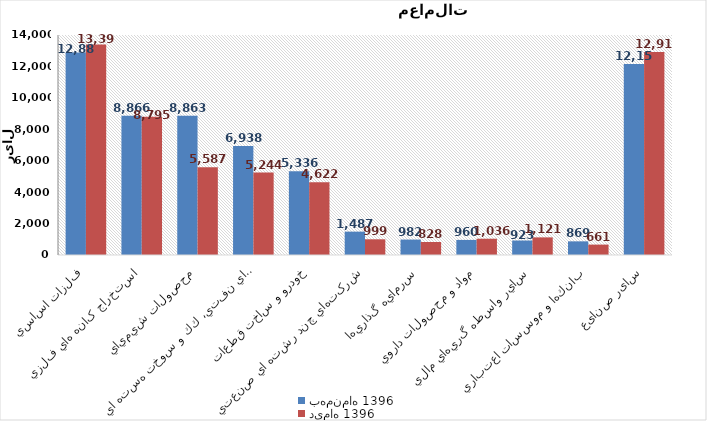
| Category | بهمن‌ماه 1396 | دی‌ماه 1396 |
|---|---|---|
| فلزات اساسي | 12885.17 | 13396.637 |
| استخراج کانه هاي فلزي | 8866.176 | 8794.66 |
| محصولات شيميايي | 8862.782 | 5586.867 |
| فراورده هاي نفتي، كك و سوخت هسته اي | 6937.701 | 5243.905 |
| خودرو و ساخت قطعات | 5336.076 | 4622.441 |
| شرکتهاي چند رشته اي صنعتي | 1486.713 | 999.453 |
| سرمايه گذاريها | 981.91 | 827.965 |
| مواد و محصولات دارويي | 959.879 | 1035.883 |
| ساير واسطه گريهاي مالي | 923.057 | 1121.428 |
| بانكها و موسسات اعتباري | 869.054 | 661.496 |
| سایر صنایع | 12153.522 | 12918.464 |